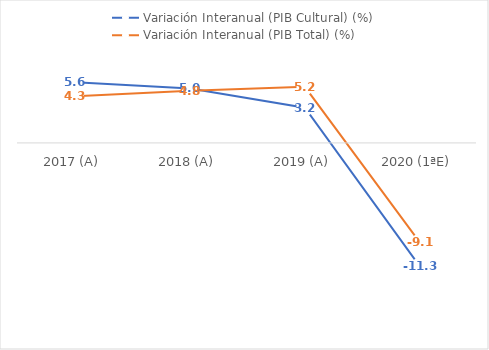
| Category | Variación Interanual (PIB Cultural) (%) | Variación Interanual (PIB Total) (%) |
|---|---|---|
| 2017 (A) | 5.583 | 4.289 |
| 2018 (A) | 5.013 | 4.812 |
| 2019 (A) | 3.233 | 5.165 |
| 2020 (1ªE) | -11.339 | -9.141 |